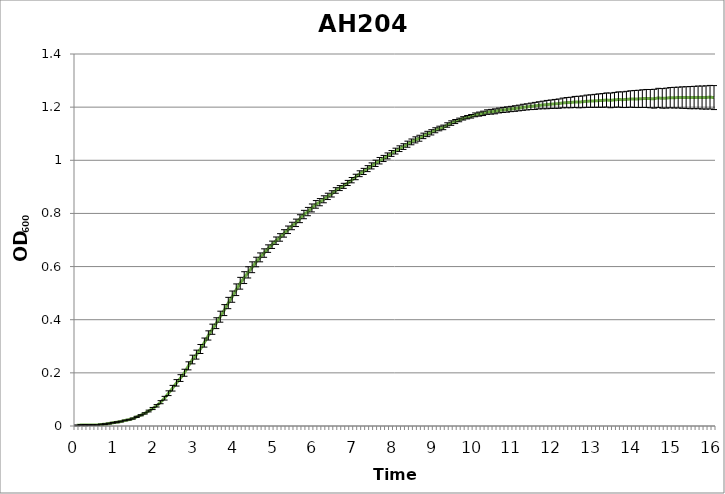
| Category | AH201 LB |
|---|---|
| 0.0 | 0.002 |
| nan | 0.004 |
| nan | 0.003 |
| nan | 0.004 |
| nan | 0.004 |
| nan | 0.004 |
| nan | 0.006 |
| nan | 0.007 |
| nan | 0.009 |
| nan | 0.012 |
| 1.0 | 0.014 |
| nan | 0.017 |
| nan | 0.021 |
| nan | 0.024 |
| nan | 0.028 |
| nan | 0.034 |
| nan | 0.04 |
| nan | 0.047 |
| nan | 0.056 |
| nan | 0.066 |
| 2.0 | 0.076 |
| nan | 0.09 |
| nan | 0.105 |
| nan | 0.123 |
| nan | 0.142 |
| nan | 0.162 |
| nan | 0.18 |
| nan | 0.2 |
| nan | 0.226 |
| nan | 0.25 |
| 3.0 | 0.269 |
| nan | 0.29 |
| nan | 0.314 |
| nan | 0.341 |
| nan | 0.364 |
| nan | 0.387 |
| nan | 0.411 |
| nan | 0.436 |
| nan | 0.463 |
| nan | 0.487 |
| 4.0 | 0.513 |
| nan | 0.537 |
| nan | 0.558 |
| nan | 0.578 |
| nan | 0.597 |
| nan | 0.617 |
| nan | 0.635 |
| nan | 0.651 |
| nan | 0.668 |
| nan | 0.682 |
| 5.0 | 0.697 |
| nan | 0.71 |
| nan | 0.725 |
| nan | 0.738 |
| nan | 0.753 |
| nan | 0.765 |
| nan | 0.78 |
| nan | 0.796 |
| nan | 0.807 |
| nan | 0.821 |
| 6.0 | 0.834 |
| nan | 0.842 |
| nan | 0.853 |
| nan | 0.864 |
| nan | 0.874 |
| nan | 0.886 |
| nan | 0.895 |
| nan | 0.904 |
| nan | 0.915 |
| nan | 0.925 |
| 7.0 | 0.937 |
| nan | 0.949 |
| nan | 0.958 |
| nan | 0.969 |
| nan | 0.979 |
| nan | 0.989 |
| nan | 0.998 |
| nan | 1.007 |
| nan | 1.016 |
| nan | 1.026 |
| 8.0 | 1.035 |
| nan | 1.044 |
| nan | 1.052 |
| nan | 1.061 |
| nan | 1.069 |
| nan | 1.077 |
| nan | 1.083 |
| nan | 1.092 |
| nan | 1.099 |
| nan | 1.105 |
| 9.0 | 1.113 |
| nan | 1.12 |
| nan | 1.124 |
| nan | 1.133 |
| nan | 1.14 |
| nan | 1.146 |
| nan | 1.152 |
| nan | 1.158 |
| nan | 1.162 |
| nan | 1.166 |
| 10.0 | 1.171 |
| nan | 1.174 |
| nan | 1.177 |
| nan | 1.181 |
| nan | 1.183 |
| nan | 1.184 |
| nan | 1.187 |
| nan | 1.189 |
| nan | 1.191 |
| nan | 1.193 |
| 11.0 | 1.195 |
| nan | 1.197 |
| nan | 1.199 |
| nan | 1.201 |
| nan | 1.203 |
| nan | 1.205 |
| nan | 1.207 |
| nan | 1.208 |
| nan | 1.21 |
| nan | 1.211 |
| 12.0 | 1.212 |
| nan | 1.213 |
| nan | 1.216 |
| nan | 1.217 |
| nan | 1.217 |
| nan | 1.219 |
| nan | 1.219 |
| nan | 1.22 |
| nan | 1.222 |
| nan | 1.223 |
| 13.0 | 1.224 |
| nan | 1.225 |
| nan | 1.225 |
| nan | 1.227 |
| nan | 1.225 |
| nan | 1.227 |
| nan | 1.229 |
| nan | 1.228 |
| nan | 1.229 |
| nan | 1.231 |
| 14.0 | 1.231 |
| nan | 1.231 |
| nan | 1.232 |
| nan | 1.233 |
| nan | 1.232 |
| nan | 1.232 |
| nan | 1.235 |
| nan | 1.233 |
| nan | 1.234 |
| nan | 1.236 |
| 15.0 | 1.236 |
| nan | 1.236 |
| nan | 1.236 |
| nan | 1.236 |
| nan | 1.236 |
| nan | 1.236 |
| nan | 1.237 |
| nan | 1.236 |
| nan | 1.236 |
| nan | 1.237 |
| 16.0 | 1.236 |